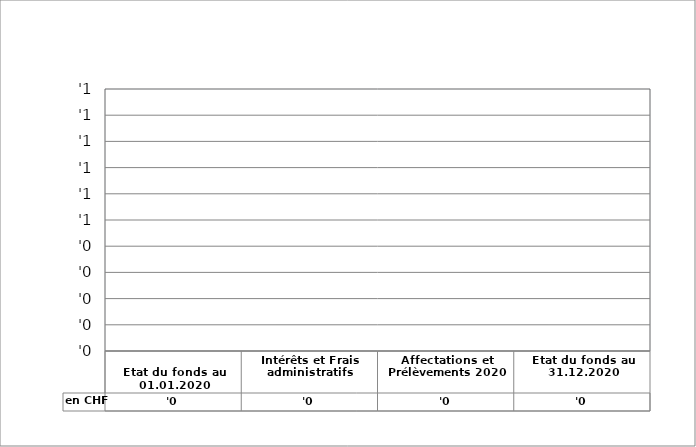
| Category | en CHF |
|---|---|
| 
Etat du fonds au 01.01.2020

 | 0 |
| Intérêts et Frais administratifs | 0 |
| Affectations et Prélèvements 2020 | 0 |
| Etat du fonds au 31.12.2020 | 0 |